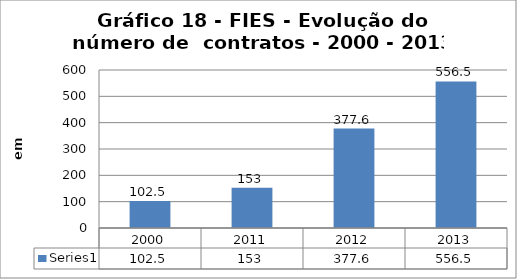
| Category | Series 0 |
|---|---|
| 2000.0 | 102.5 |
| 2011.0 | 153 |
| 2012.0 | 377.6 |
| 2013.0 | 556.5 |